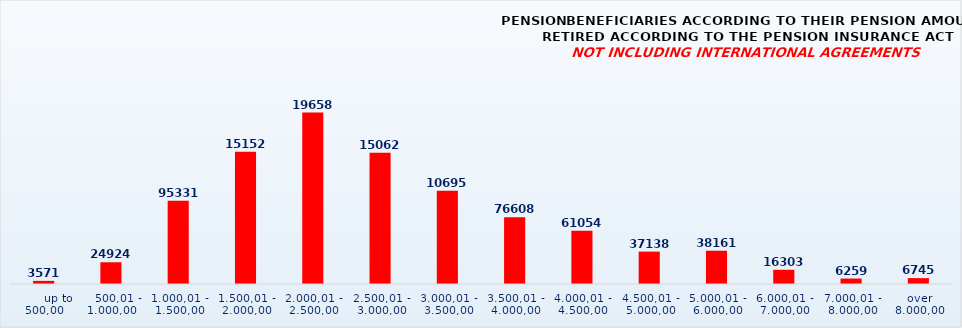
| Category | PENSION BENEFICIARIES ACCORDING TO TYPES AND AMOUNTS OF PENSION, RETIRED ACCORDING TO THE PENSION INSURANCE ACT
NOT INCLUDING INTERNATIONAL AGREEMENTS |
|---|---|
|       up to 500,00 | 3571 |
|    500,01 - 1.000,00 | 24924 |
| 1.000,01 - 1.500,00 | 95331 |
| 1.500,01 - 2.000,00 | 151522 |
| 2.000,01 - 2.500,00 | 196585 |
| 2.500,01 - 3.000,00 | 150627 |
| 3.000,01 - 3.500,00 | 106956 |
| 3.500,01 - 4.000,00 | 76608 |
| 4.000,01 - 4.500,00 | 61054 |
| 4.500,01 - 5.000,00 | 37138 |
| 5.000,01 - 6.000,00 | 38161 |
| 6.000,01 - 7.000,00 | 16303 |
| 7.000,01 - 8.000,00 | 6259 |
|  over  8.000,00 | 6745 |